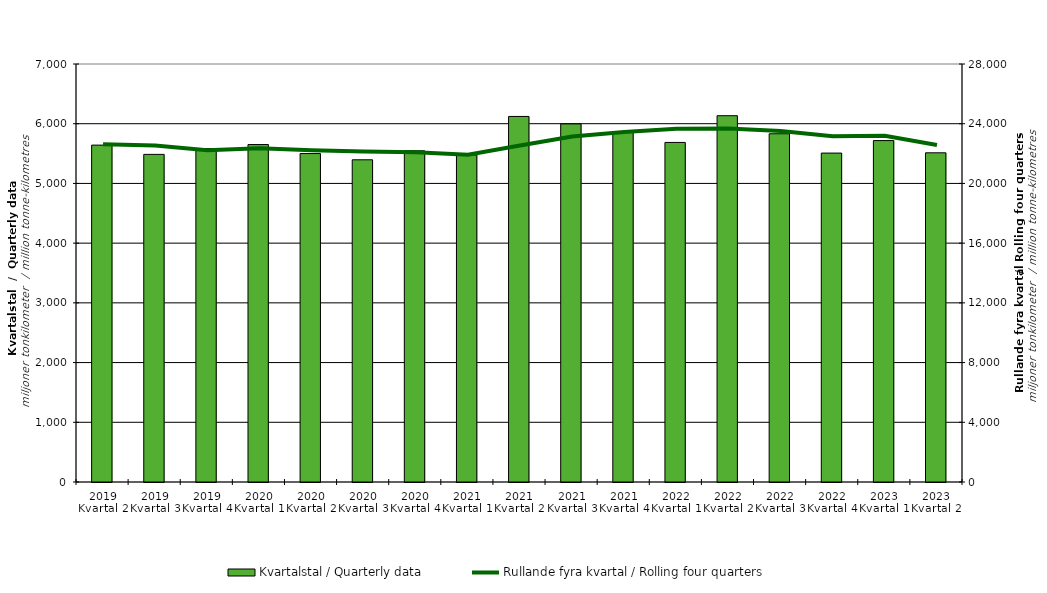
| Category | Kvartalstal / Quarterly data |
|---|---|
| 2019 Kvartal 2 | 5641.612 |
| 2019 Kvartal 3 | 5486.395 |
| 2019 Kvartal 4 | 5584.286 |
| 2020 Kvartal 1 | 5650.915 |
| 2020 Kvartal 2 | 5500.334 |
| 2020 Kvartal 3 | 5395.987 |
| 2020 Kvartal 4 | 5546.662 |
| 2021 Kvartal 1 | 5476.427 |
| 2021 Kvartal 2 | 6121.807 |
| 2021 Kvartal 3 | 5996.688 |
| 2021 Kvartal 4 | 5853.966 |
| 2022 Kvartal 1 | 5686.696 |
| 2022 Kvartal 2 | 6134.1 |
| 2022 Kvartal 3 | 5831.909 |
| 2022 Kvartal 4 | 5508.231 |
| 2023 Kvartal 1 | 5717.368 |
| 2023 Kvartal 2 | 5512.865 |